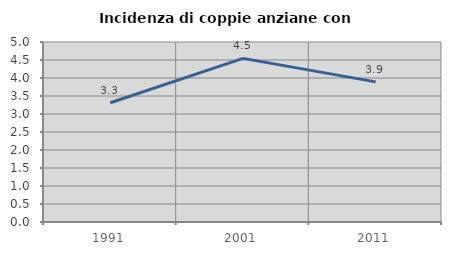
| Category | Incidenza di coppie anziane con figli |
|---|---|
| 1991.0 | 3.313 |
| 2001.0 | 4.545 |
| 2011.0 | 3.892 |